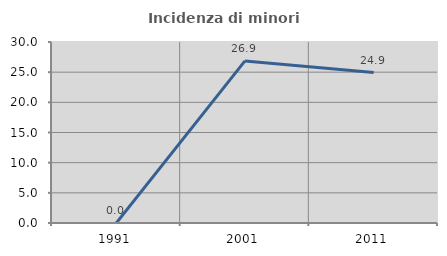
| Category | Incidenza di minori stranieri |
|---|---|
| 1991.0 | 0 |
| 2001.0 | 26.866 |
| 2011.0 | 24.938 |